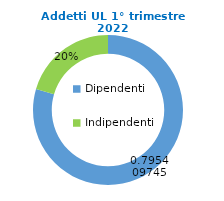
| Category | Series 0 |
|---|---|
| Dipendenti | 102895 |
| Indipendenti | 26466 |